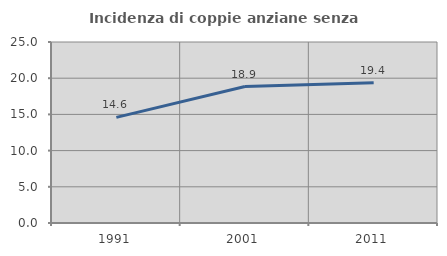
| Category | Incidenza di coppie anziane senza figli  |
|---|---|
| 1991.0 | 14.595 |
| 2001.0 | 18.852 |
| 2011.0 | 19.363 |